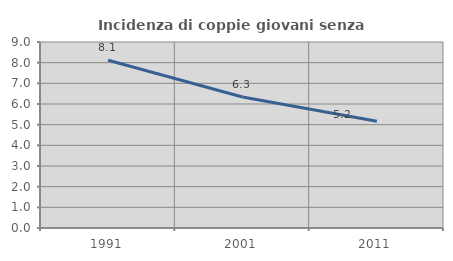
| Category | Incidenza di coppie giovani senza figli |
|---|---|
| 1991.0 | 8.114 |
| 2001.0 | 6.342 |
| 2011.0 | 5.168 |